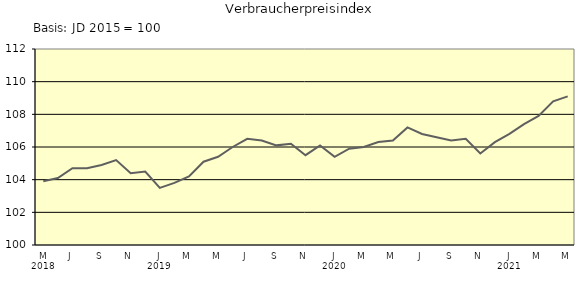
| Category | Series 0 |
|---|---|
| 0 | 103.9 |
| 1 | 104.1 |
| 2 | 104.7 |
| 3 | 104.7 |
| 4 | 104.9 |
| 5 | 105.2 |
| 6 | 104.4 |
| 7 | 104.5 |
| 8 | 103.5 |
| 9 | 103.8 |
| 10 | 104.2 |
| 11 | 105.1 |
| 12 | 105.4 |
| 13 | 106 |
| 14 | 106.5 |
| 15 | 106.4 |
| 16 | 106.1 |
| 17 | 106.2 |
| 18 | 105.5 |
| 19 | 106.1 |
| 20 | 105.4 |
| 21 | 105.9 |
| 22 | 106 |
| 23 | 106.3 |
| 24 | 106.4 |
| 25 | 107.2 |
| 26 | 106.8 |
| 27 | 106.6 |
| 28 | 106.4 |
| 29 | 106.5 |
| 30 | 105.6 |
| 31 | 106.3 |
| 32 | 106.8 |
| 33 | 107.4 |
| 34 | 107.9 |
| 35 | 108.8 |
| 36 | 109.1 |